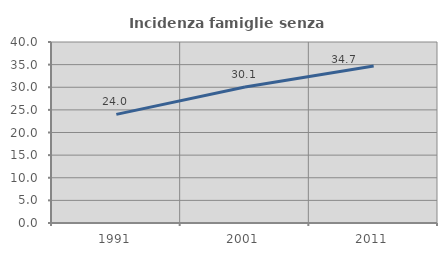
| Category | Incidenza famiglie senza nuclei |
|---|---|
| 1991.0 | 24.004 |
| 2001.0 | 30.055 |
| 2011.0 | 34.674 |